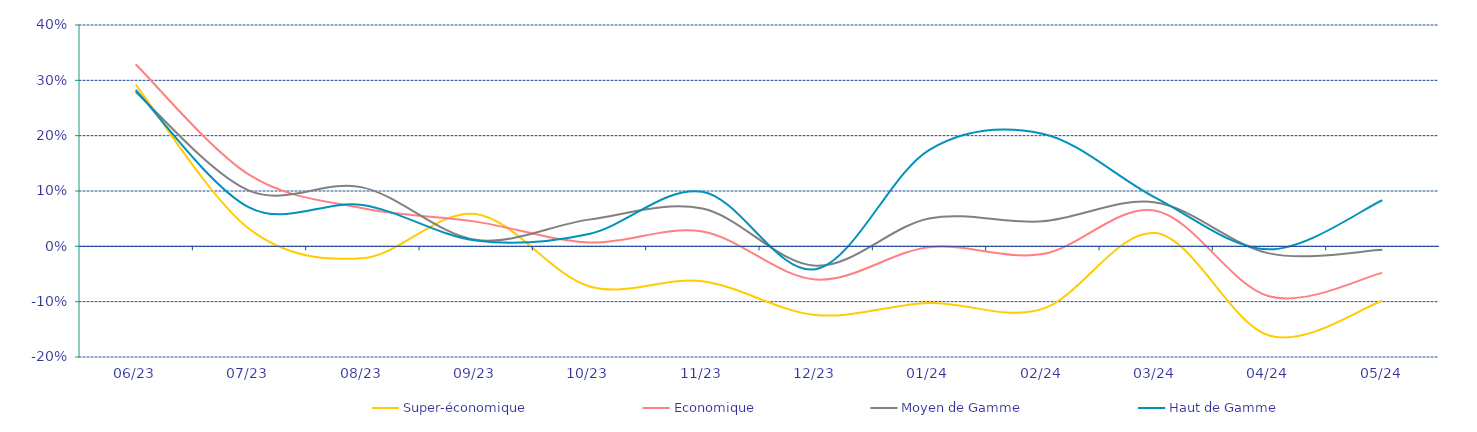
| Category | Super-économique | Economique | Moyen de Gamme | Haut de Gamme |
|---|---|---|---|---|
| 2023-06-01 | 0.292 | 0.329 | 0.279 | 0.282 |
| 2023-07-01 | 0.032 | 0.129 | 0.101 | 0.07 |
| 2023-08-01 | -0.021 | 0.069 | 0.107 | 0.075 |
| 2023-09-01 | 0.058 | 0.045 | 0.012 | 0.011 |
| 2023-10-01 | -0.072 | 0.007 | 0.048 | 0.022 |
| 2023-11-01 | -0.063 | 0.027 | 0.068 | 0.099 |
| 2023-12-01 | -0.124 | -0.06 | -0.035 | -0.041 |
| 2024-01-01 | -0.102 | -0.002 | 0.05 | 0.174 |
| 2024-02-01 | -0.113 | -0.014 | 0.045 | 0.204 |
| 2024-03-01 | 0.024 | 0.064 | 0.079 | 0.088 |
| 2024-04-01 | -0.161 | -0.09 | -0.013 | -0.005 |
| 2024-05-01 | -0.098 | -0.048 | -0.006 | 0.083 |